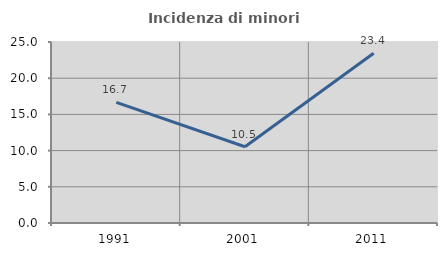
| Category | Incidenza di minori stranieri |
|---|---|
| 1991.0 | 16.667 |
| 2001.0 | 10.526 |
| 2011.0 | 23.438 |